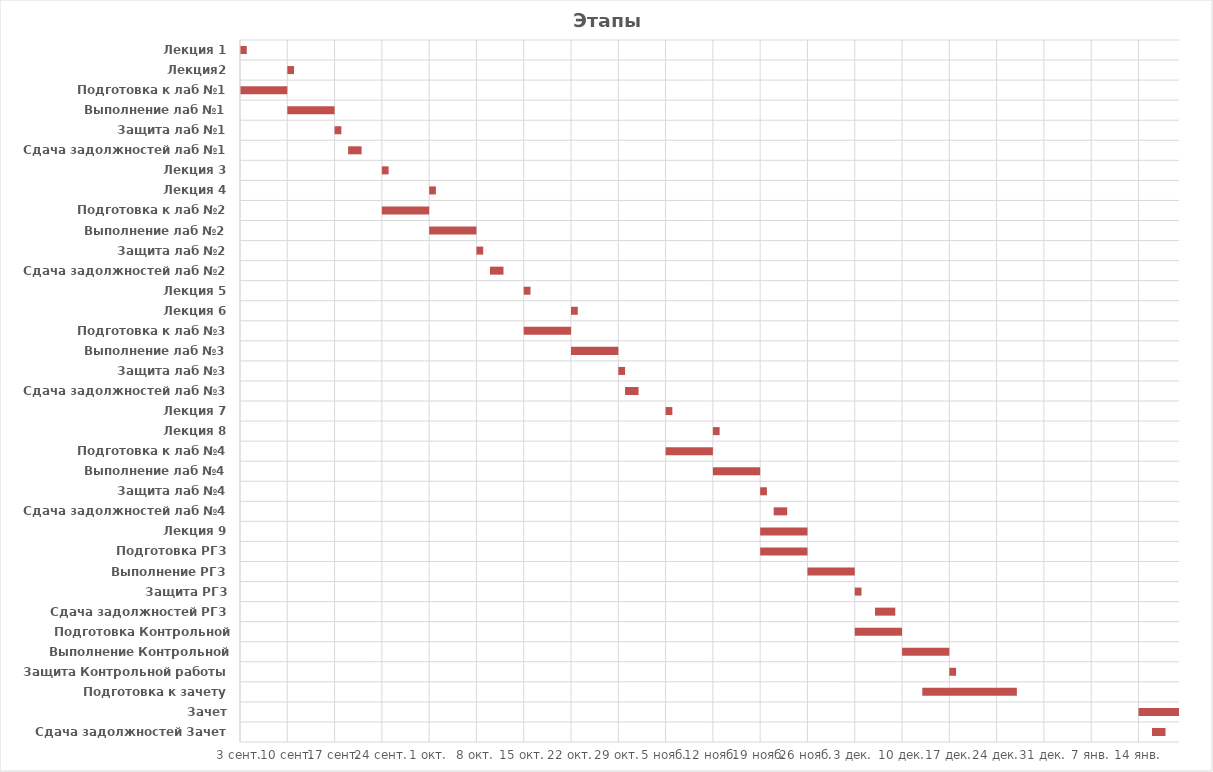
| Category | Дата | Продолжительность, дни |
|---|---|---|
| Лекция 1 | 2018-09-03 | 1 |
| Лекция2 | 2018-09-10 | 1 |
| Подготовка к лаб №1 | 2018-09-03 | 7 |
| Выполнение лаб №1 | 2018-09-10 | 7 |
| Защита лаб №1 | 2018-09-17 | 1 |
| Сдача задолжностей лаб №1 | 2018-09-19 | 2 |
| Лекция 3 | 2018-09-24 | 1 |
| Лекция 4 | 2018-10-01 | 1 |
| Подготовка к лаб №2 | 2018-09-24 | 7 |
| Выполнение лаб №2 | 2018-10-01 | 7 |
| Защита лаб №2 | 2018-10-08 | 1 |
| Сдача задолжностей лаб №2 | 2018-10-10 | 2 |
| Лекция 5 | 2018-10-15 | 1 |
| Лекция 6 | 2018-10-22 | 1 |
| Подготовка к лаб №3 | 2018-10-15 | 7 |
| Выполнение лаб №3 | 2018-10-22 | 7 |
| Защита лаб №3 | 2018-10-29 | 1 |
| Сдача задолжностей лаб №3 | 2018-10-30 | 2 |
| Лекция 7 | 2018-11-05 | 1 |
| Лекция 8 | 2018-11-12 | 1 |
| Подготовка к лаб №4 | 2018-11-05 | 7 |
| Выполнение лаб №4 | 2018-11-12 | 7 |
| Защита лаб №4 | 2018-11-19 | 1 |
| Сдача задолжностей лаб №4 | 2018-11-21 | 2 |
| Лекция 9 | 2018-11-19 | 7 |
| Подготовка РГЗ | 2018-11-19 | 7 |
| Выполнение РГЗ | 2018-11-26 | 7 |
| Защита РГЗ | 2018-12-03 | 1 |
| Сдача задолжностей РГЗ | 2018-12-06 | 3 |
| Подготовка Контрольной работы | 2018-12-03 | 7 |
| Выполнение Контрольной работы | 2018-12-10 | 7 |
| Защита Контрольной работы | 2018-12-17 | 1 |
| Подготовка к зачету | 2018-12-13 | 14 |
| Зачет | 2019-01-14 | 14 |
| Сдача задолжностей Зачет | 2019-01-16 | 2 |